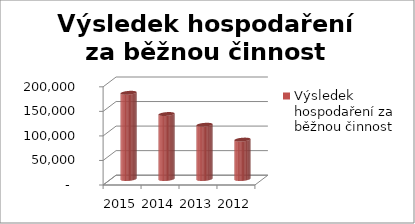
| Category | Výsledek hospodaření za běžnou činnost |
|---|---|
| 2015.0 | 175640 |
| 2014.0 | 132370 |
| 2013.0 | 110518 |
| 2012.0 | 80299 |